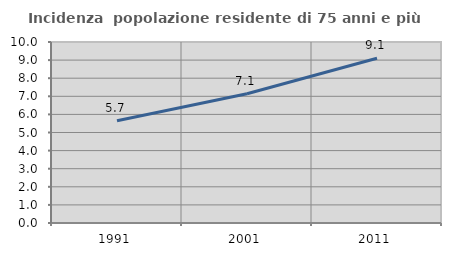
| Category | Incidenza  popolazione residente di 75 anni e più |
|---|---|
| 1991.0 | 5.651 |
| 2001.0 | 7.14 |
| 2011.0 | 9.104 |